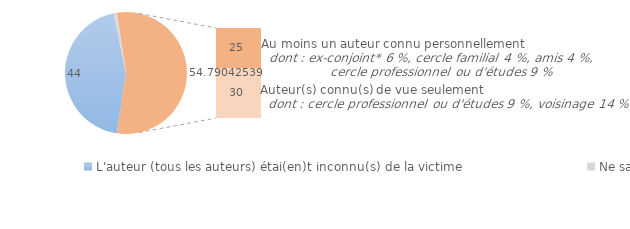
| Category | Series 0 |
|---|---|
| L'auteur (tous les auteurs) étai(en)t inconnu(s) de la victime | 44.322 |
| Ne sait pas/Refus | 0.888 |
| L'auteur (au moins un auteur) était connu de vue ou personnellement  | 24.554 |